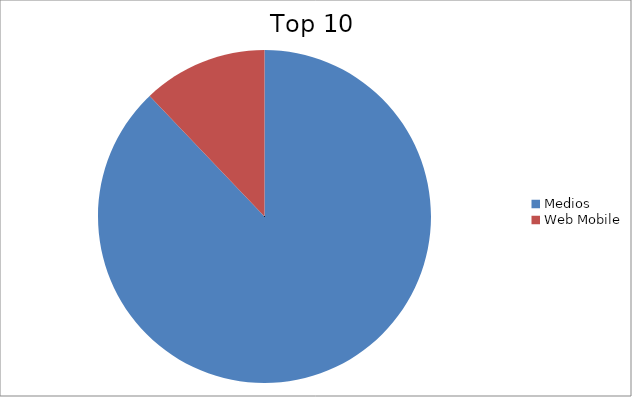
| Category | Series 0 |
|---|---|
| Medios | 87.88 |
| Web Mobile | 12.12 |